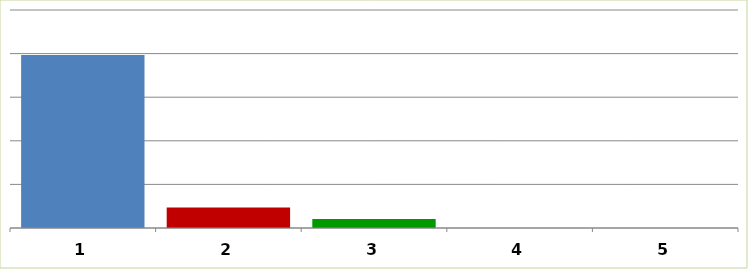
| Category | Series 0 |
|---|---|
| 0 | 198354231.412 |
| 1 | 23536896 |
| 2 | 10459321.3 |
| 3 | 0 |
| 4 | 0 |